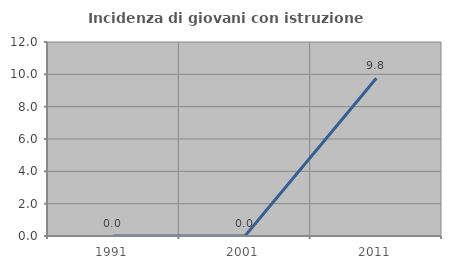
| Category | Incidenza di giovani con istruzione universitaria |
|---|---|
| 1991.0 | 0 |
| 2001.0 | 0 |
| 2011.0 | 9.756 |